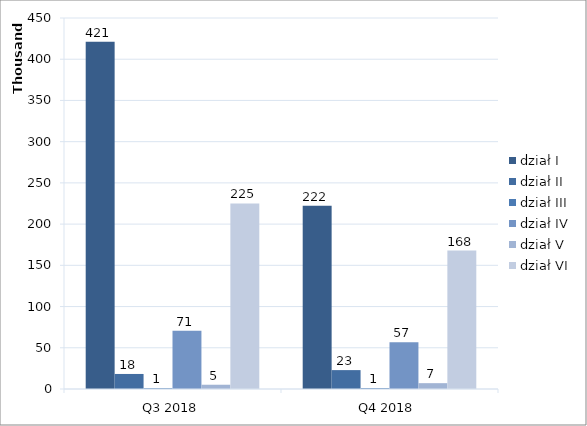
| Category | dział I | dział II | dział III | dział IV | dział V | dział VI |
|---|---|---|---|---|---|---|
| Q3 2018 | 421310 | 18241 | 969 | 70678 | 5167 | 225140 |
| Q4 2018 | 222342 | 22914 | 1091 | 56727 | 7077 | 167849 |